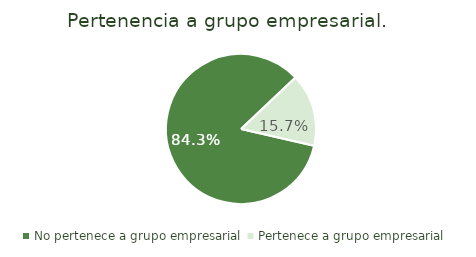
| Category | Series 0 |
|---|---|
| No pertenece a grupo empresarial  | 0.843 |
| Pertenece a grupo empresarial  | 0.157 |